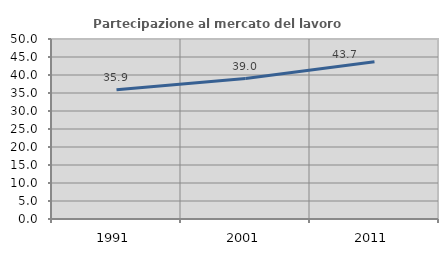
| Category | Partecipazione al mercato del lavoro  femminile |
|---|---|
| 1991.0 | 35.877 |
| 2001.0 | 39.021 |
| 2011.0 | 43.709 |